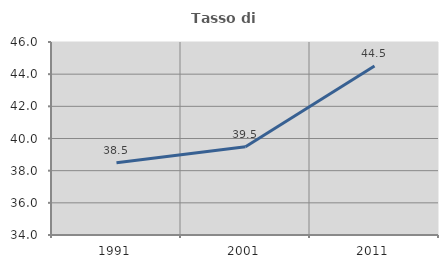
| Category | Tasso di occupazione   |
|---|---|
| 1991.0 | 38.497 |
| 2001.0 | 39.482 |
| 2011.0 | 44.507 |